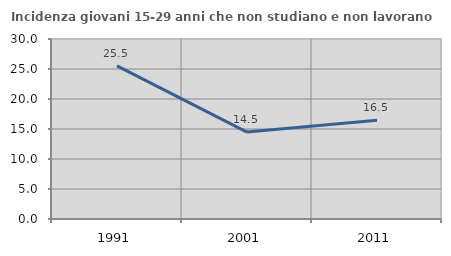
| Category | Incidenza giovani 15-29 anni che non studiano e non lavorano  |
|---|---|
| 1991.0 | 25.517 |
| 2001.0 | 14.483 |
| 2011.0 | 16.466 |